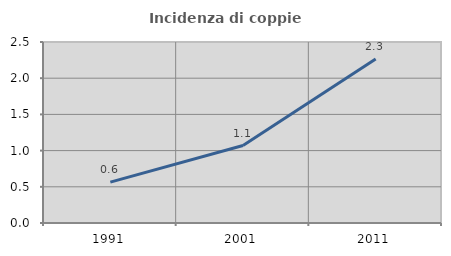
| Category | Incidenza di coppie miste |
|---|---|
| 1991.0 | 0.565 |
| 2001.0 | 1.07 |
| 2011.0 | 2.264 |